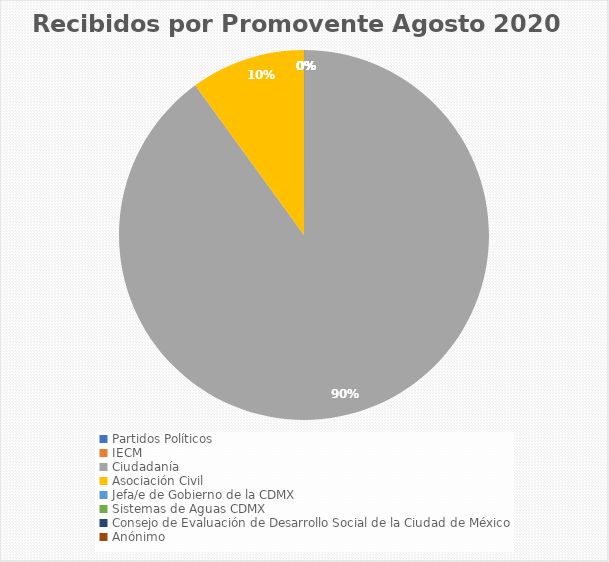
| Category | Recibidos por Promovente Agosto |
|---|---|
| Partidos Políticos | 0 |
| IECM | 0 |
| Ciudadanía  | 9 |
| Asociación Civil | 1 |
| Jefa/e de Gobierno de la CDMX | 0 |
| Sistemas de Aguas CDMX | 0 |
| Consejo de Evaluación de Desarrollo Social de la Ciudad de México | 0 |
| Anónimo | 0 |